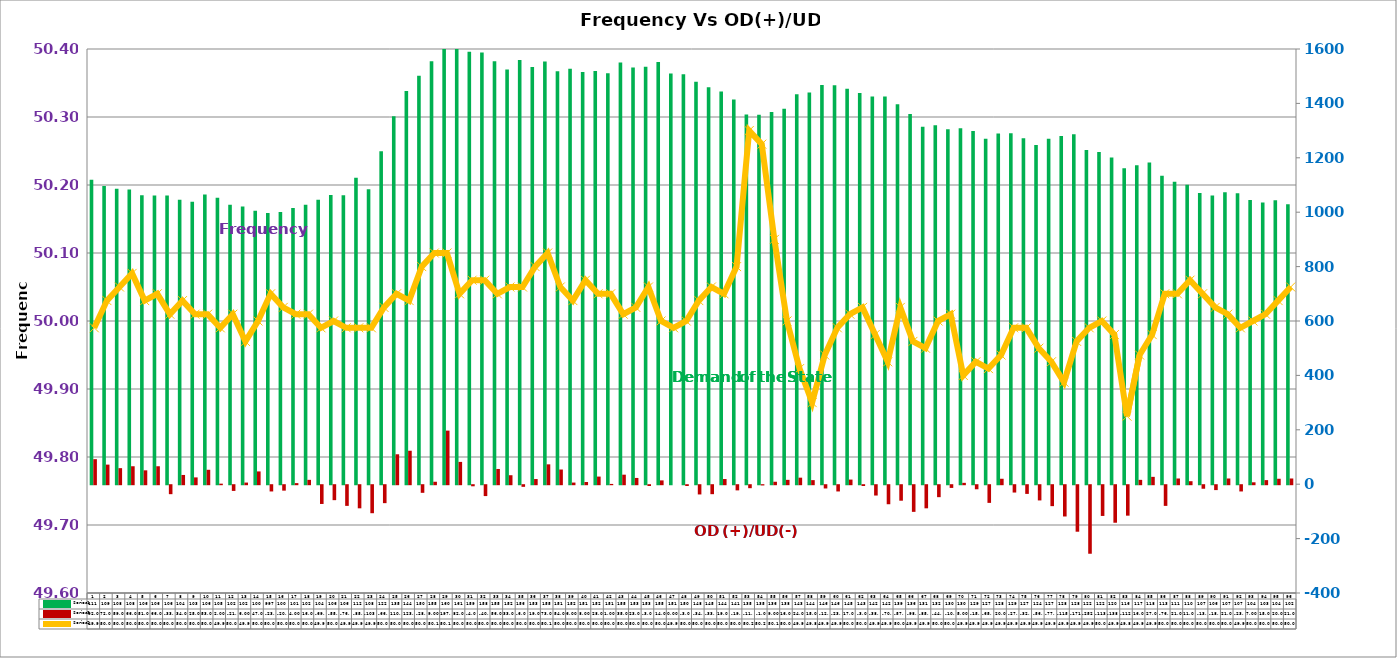
| Category | Series 2 | Series 4 |
|---|---|---|
| 0 | 1119 | 92 |
| 1 | 1096 | 72 |
| 2 | 1086 | 59 |
| 3 | 1083 | 66 |
| 4 | 1062 | 51 |
| 5 | 1061 | 66 |
| 6 | 1061 | -33 |
| 7 | 1046 | 34 |
| 8 | 1038 | 25 |
| 9 | 1065 | 53 |
| 10 | 1053 | 2 |
| 11 | 1027 | -21 |
| 12 | 1021 | 6 |
| 13 | 1005 | 47 |
| 14 | 997 | -23 |
| 15 | 1001 | -20 |
| 16 | 1015 | 4 |
| 17 | 1027.667 | 16 |
| 18 | 1046 | -69 |
| 19 | 1063 | -55 |
| 20 | 1062 | -76 |
| 21 | 1127 | -85 |
| 22 | 1084 | -103 |
| 23 | 1224 | -66 |
| 24 | 1353 | 110 |
| 25 | 1446 | 123 |
| 26 | 1502 | -28 |
| 27 | 1555 | 9 |
| 28 | 1604 | 197 |
| 29 | 1610 | 82 |
| 30 | 1590 | -4 |
| 31 | 1587 | -40 |
| 32 | 1555 | 56 |
| 33 | 1525 | 33 |
| 34 | 1560 | -6 |
| 35 | 1534 | 19 |
| 36 | 1553.667 | 73 |
| 37 | 1518.5 | 54 |
| 38 | 1527.5 | 6 |
| 39 | 1515.5 | 8 |
| 40 | 1519.5 | 28 |
| 41 | 1510.5 | 1 |
| 42 | 1550.5 | 35 |
| 43 | 1532 | 23 |
| 44 | 1535 | -3 |
| 45 | 1552 | 14 |
| 46 | 1510 | 0 |
| 47 | 1507 | -3 |
| 48 | 1480 | -34 |
| 49 | 1459 | -33 |
| 50 | 1444 | 19 |
| 51 | 1414 | -19 |
| 52 | 1359 | -11 |
| 53 | 1358 | -1 |
| 54 | 1368 | 9 |
| 55 | 1380 | 16 |
| 56 | 1434 | 24 |
| 57 | 1440 | 15 |
| 58 | 1468 | -12 |
| 59 | 1467 | -23 |
| 60 | 1454 | 17 |
| 61 | 1438 | -3 |
| 62 | 1425 | -38 |
| 63 | 1425 | -70 |
| 64 | 1396.733 | -57 |
| 65 | 1361.2 | -98 |
| 66 | 1314.6 | -85 |
| 67 | 1319.733 | -44 |
| 68 | 1305.267 | -10 |
| 69 | 1308.467 | 5 |
| 70 | 1298.467 | -15 |
| 71 | 1270 | -65 |
| 72 | 1289 | 20 |
| 73 | 1290 | -27 |
| 74 | 1272 | -32 |
| 75 | 1247 | -56 |
| 76 | 1270 | -77 |
| 77 | 1280 | -115 |
| 78 | 1287 | -171 |
| 79 | 1229 | -252 |
| 80 | 1221 | -113 |
| 81 | 1201 | -138 |
| 82 | 1162 | -112 |
| 83 | 1173 | 16 |
| 84 | 1183 | 27 |
| 85 | 1134 | -76 |
| 86 | 1112 | 21 |
| 87 | 1101 | 11 |
| 88 | 1071 | -13 |
| 89 | 1061.733 | -18 |
| 90 | 1073 | 21 |
| 91 | 1070 | -23 |
| 92 | 1045 | 7 |
| 93 | 1036 | 15 |
| 94 | 1044 | 20 |
| 95 | 1029 | 21 |